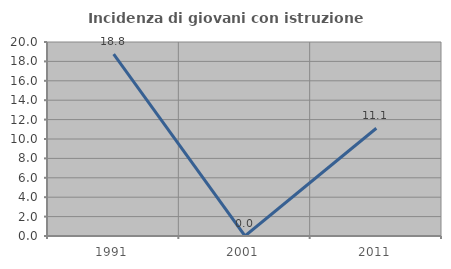
| Category | Incidenza di giovani con istruzione universitaria |
|---|---|
| 1991.0 | 18.75 |
| 2001.0 | 0 |
| 2011.0 | 11.111 |